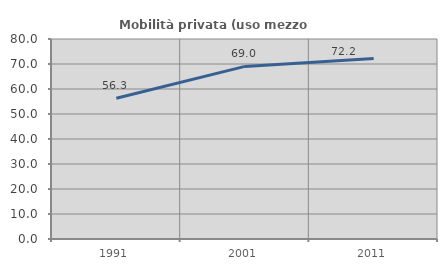
| Category | Mobilità privata (uso mezzo privato) |
|---|---|
| 1991.0 | 56.285 |
| 2001.0 | 69.04 |
| 2011.0 | 72.225 |